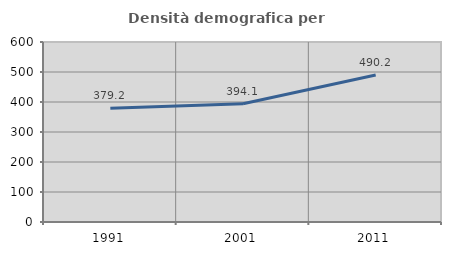
| Category | Densità demografica |
|---|---|
| 1991.0 | 379.248 |
| 2001.0 | 394.111 |
| 2011.0 | 490.224 |